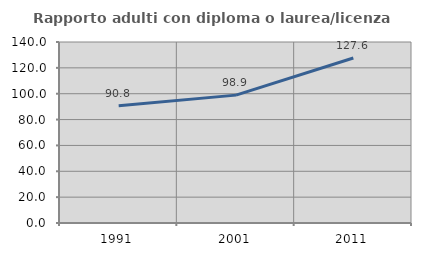
| Category | Rapporto adulti con diploma o laurea/licenza media  |
|---|---|
| 1991.0 | 90.766 |
| 2001.0 | 98.911 |
| 2011.0 | 127.627 |